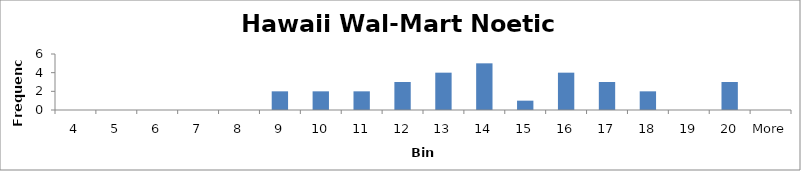
| Category | Frequency |
|---|---|
| 4 | 0 |
| 5 | 0 |
| 6 | 0 |
| 7 | 0 |
| 8 | 0 |
| 9 | 2 |
| 10 | 2 |
| 11 | 2 |
| 12 | 3 |
| 13 | 4 |
| 14 | 5 |
| 15 | 1 |
| 16 | 4 |
| 17 | 3 |
| 18 | 2 |
| 19 | 0 |
| 20 | 3 |
| More | 0 |